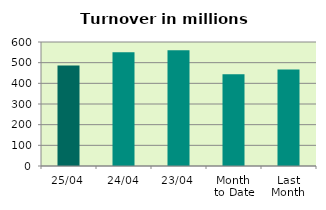
| Category | Series 0 |
|---|---|
| 25/04 | 486.616 |
| 24/04 | 550.021 |
| 23/04 | 559.957 |
| Month 
to Date | 444.491 |
| Last
Month | 466.511 |